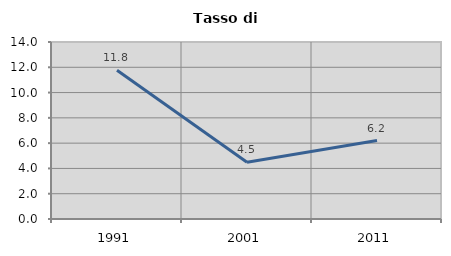
| Category | Tasso di disoccupazione   |
|---|---|
| 1991.0 | 11.763 |
| 2001.0 | 4.485 |
| 2011.0 | 6.208 |